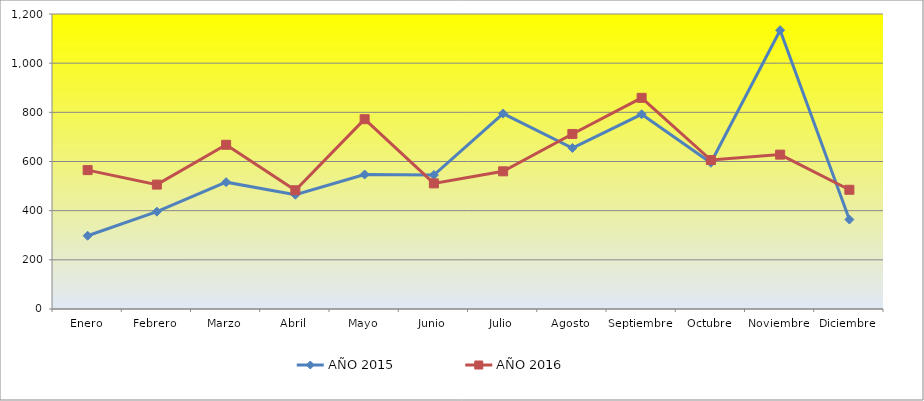
| Category | AÑO 2015 | AÑO 2016 |
|---|---|---|
| Enero | 298 | 565 |
| Febrero | 396 | 506 |
| Marzo | 516 | 668 |
| Abril | 465 | 483 |
| Mayo | 547 | 772 |
| Junio | 545 | 511 |
| Julio | 795 | 560 |
| Agosto | 655 | 712 |
| Septiembre | 792 | 859 |
| Octubre | 595 | 606 |
| Noviembre | 1134 | 628 |
| Diciembre | 364 | 485 |